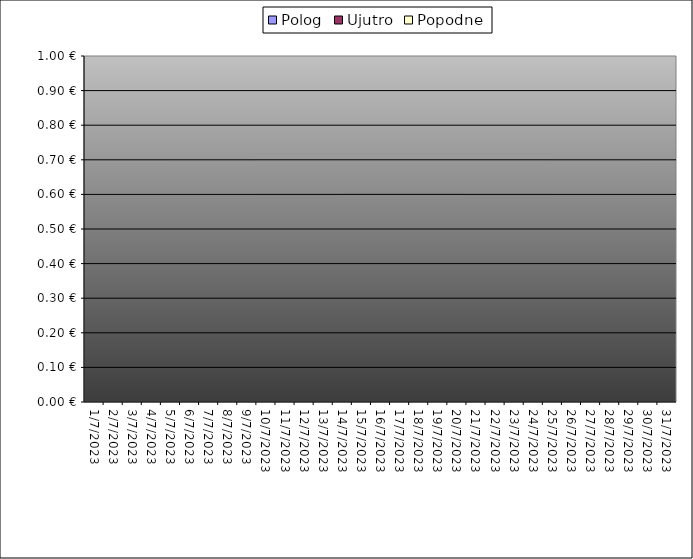
| Category | Polog | Ujutro | Popodne |
|---|---|---|---|
| 2023-07-01 |  | 0 | 0 |
| 2023-07-02 |  | 0 | 0 |
| 2023-07-03 |  | 0 | 0 |
| 2023-07-04 |  | 0 | 0 |
| 2023-07-05 |  | 0 | 0 |
| 2023-07-06 |  | 0 | 0 |
| 2023-07-07 |  | 0 | 0 |
| 2023-07-08 |  | 0 | 0 |
| 2023-07-09 |  | 0 | 0 |
| 2023-07-10 |  | 0 | 0 |
| 2023-07-11 |  | 0 | 0 |
| 2023-07-12 |  | 0 | 0 |
| 2023-07-13 |  | 0 | 0 |
| 2023-07-14 |  | 0 | 0 |
| 2023-07-15 |  | 0 | 0 |
| 2023-07-16 |  | 0 | 0 |
| 2023-07-17 |  | 0 | 0 |
| 2023-07-18 |  | 0 | 0 |
| 2023-07-19 |  | 0 | 0 |
| 2023-07-20 |  | 0 | 0 |
| 2023-07-21 |  | 0 | 0 |
| 2023-07-22 |  | 0 | 0 |
| 2023-07-23 |  | 0 | 0 |
| 2023-07-24 |  | 0 | 0 |
| 2023-07-25 |  | 0 | 0 |
| 2023-07-26 |  | 0 | 0 |
| 2023-07-27 |  | 0 | 0 |
| 2023-07-28 |  | 0 | 0 |
| 2023-07-29 |  | 0 | 0 |
| 2023-07-30 |  | 0 | 0 |
| 2023-07-31 |  | 0 | 0 |